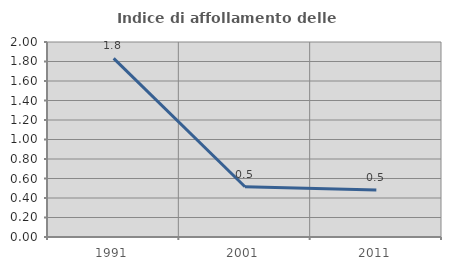
| Category | Indice di affollamento delle abitazioni  |
|---|---|
| 1991.0 | 1.832 |
| 2001.0 | 0.515 |
| 2011.0 | 0.481 |